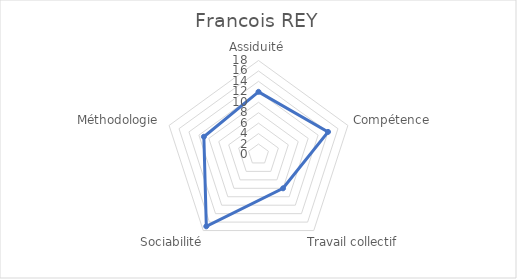
| Category | Francois REY |
|---|---|
| Assiduité | 12 |
| Compétence | 14 |
| Travail collectif | 8 |
| Sociabilité | 17 |
| Méthodologie | 11 |